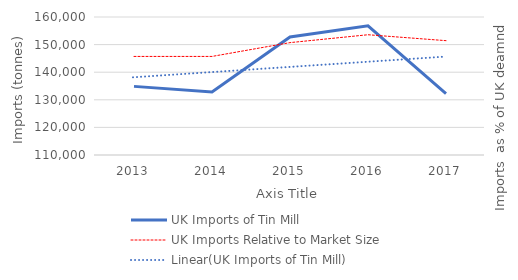
| Category | UK Imports of Tin Mill |
|---|---|
| 2013.0 | 134863 |
| 2014.0 | 132801 |
| 2015.0 | 152787 |
| 2016.0 | 156808 |
| 2017.0 | 132223 |